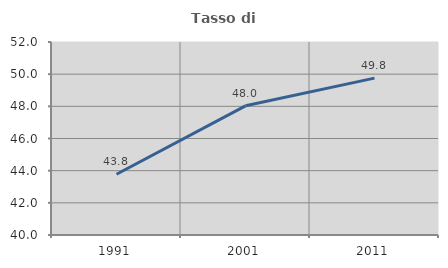
| Category | Tasso di occupazione   |
|---|---|
| 1991.0 | 43.774 |
| 2001.0 | 48.031 |
| 2011.0 | 49.752 |